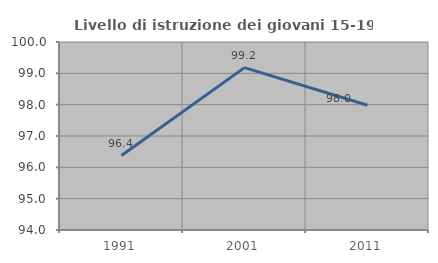
| Category | Livello di istruzione dei giovani 15-19 anni |
|---|---|
| 1991.0 | 96.375 |
| 2001.0 | 99.182 |
| 2011.0 | 97.981 |